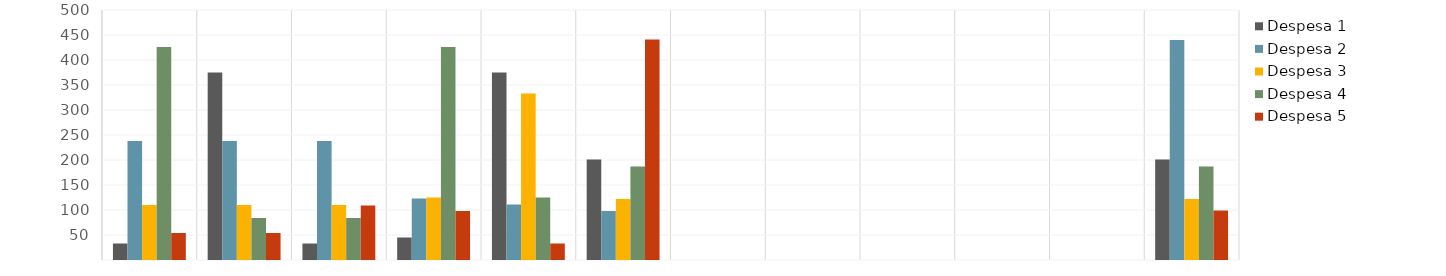
| Category | Despesa 1 | Despesa 2 | Despesa 3 | Despesa 4 | Despesa 5 |
|---|---|---|---|---|---|
| Jan | 33 | 238 | 110 | 426 | 54 |
| Fev | 375 | 238 | 110 | 84 | 54 |
| Mar | 33 | 238 | 110 | 84 | 109 |
| Abr | 45 | 123 | 125 | 426 | 98 |
| Mai | 375 | 111 | 333 | 125 | 33 |
| Jun | 201 | 98 | 122 | 187 | 441 |
| Jul | 0 | 0 | 0 | 0 | 0 |
| Ago | 0 | 0 | 0 | 0 | 0 |
| Set | 0 | 0 | 0 | 0 | 0 |
| Out | 0 | 0 | 0 | 0 | 0 |
| Nov | 0 | 0 | 0 | 0 | 0 |
| Dez | 201 | 440 | 122 | 187 | 99 |